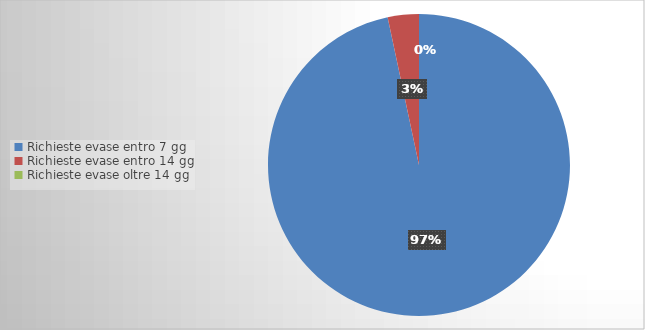
| Category | Series 0 |
|---|---|
| Richieste evase entro 7 gg | 29 |
| Richieste evase entro 14 gg | 1 |
| Richieste evase oltre 14 gg | 0 |